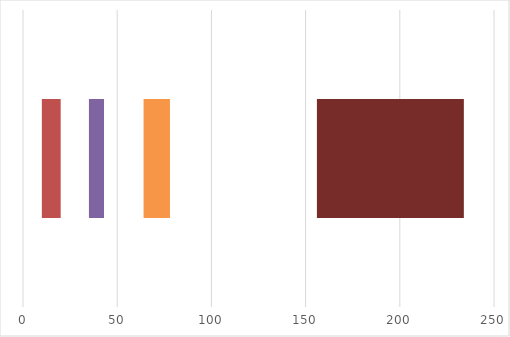
| Category | Series 0 | Series 1 | Series 2 | Series 3 | Series 4 | Series 5 | Series 6 | Series 7 |
|---|---|---|---|---|---|---|---|---|
| 0 | 10 | 10 | 15 | 8 | 21 | 14 | 78 | 78 |